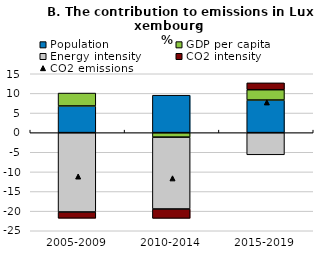
| Category | Population | GDP per capita | Energy intensity | CO2 intensity |
|---|---|---|---|---|
| 2005-2009 | 6.798 | 3.287 | -20.22 | -1.599 |
| 2010-2014 | 9.535 | -1.15 | -18.309 | -2.386 |
| 2015-2019 | 8.307 | 2.627 | -5.651 | 1.746 |